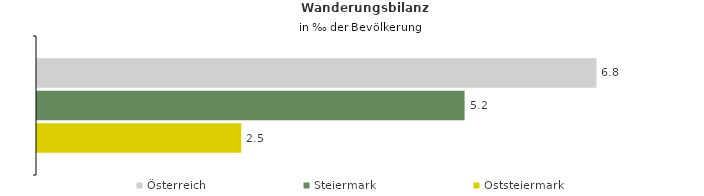
| Category | Österreich | Steiermark | Oststeiermark |
|---|---|---|---|
| Wanderungsrate in ‰ der Bevölkerung, Periode 2015-2019 | 6.771 | 5.175 | 2.472 |